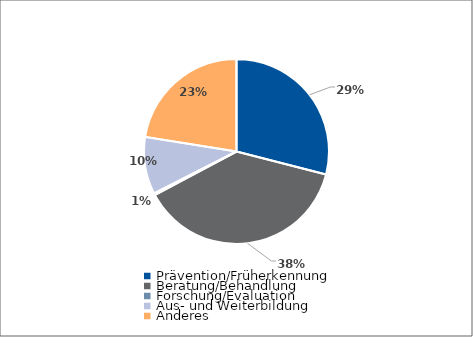
| Category | Series 0 |
|---|---|
| Prävention/Früherkennung | 47167 |
| Beratung/Behandlung | 62100 |
| Forschung/Evaluation | 532 |
| Aus- und Weiterbildung | 16250 |
| Anderes | 36542 |